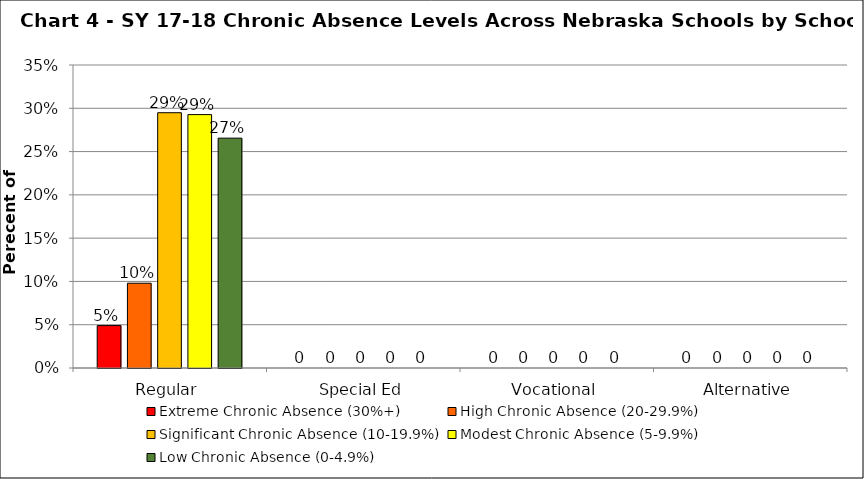
| Category | Extreme Chronic Absence (30%+) | High Chronic Absence (20-29.9%) | Significant Chronic Absence (10-19.9%) | Modest Chronic Absence (5-9.9%) | Low Chronic Absence (0-4.9%) |
|---|---|---|---|---|---|
| 0 | 0.049 | 0.098 | 0.295 | 0.293 | 0.266 |
| 1 | 0 | 0 | 0 | 0 | 0 |
| 2 | 0 | 0 | 0 | 0 | 0 |
| 3 | 0 | 0 | 0 | 0 | 0 |